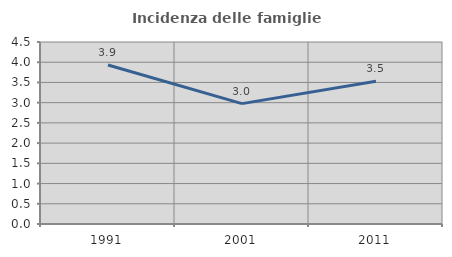
| Category | Incidenza delle famiglie numerose |
|---|---|
| 1991.0 | 3.933 |
| 2001.0 | 2.976 |
| 2011.0 | 3.529 |